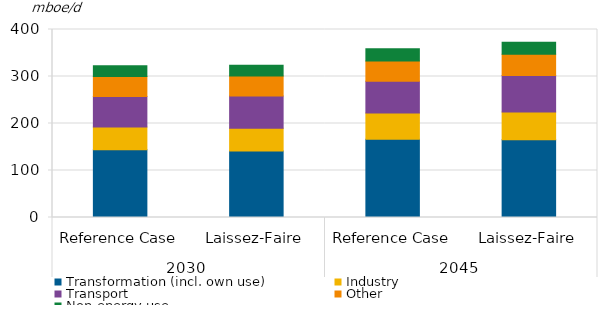
| Category | Transformation (incl. own use) | Industry | Transport | Other | Non-energy use |
|---|---|---|---|---|---|
| 0 | 144.266 | 48.159 | 65.094 | 42.673 | 22.702 |
| 1 | 141.382 | 48.568 | 68.49 | 42.777 | 22.467 |
| 2 | 166.716 | 55.464 | 67.459 | 43.501 | 26.081 |
| 3 | 165.499 | 59.029 | 77.436 | 45.128 | 25.566 |